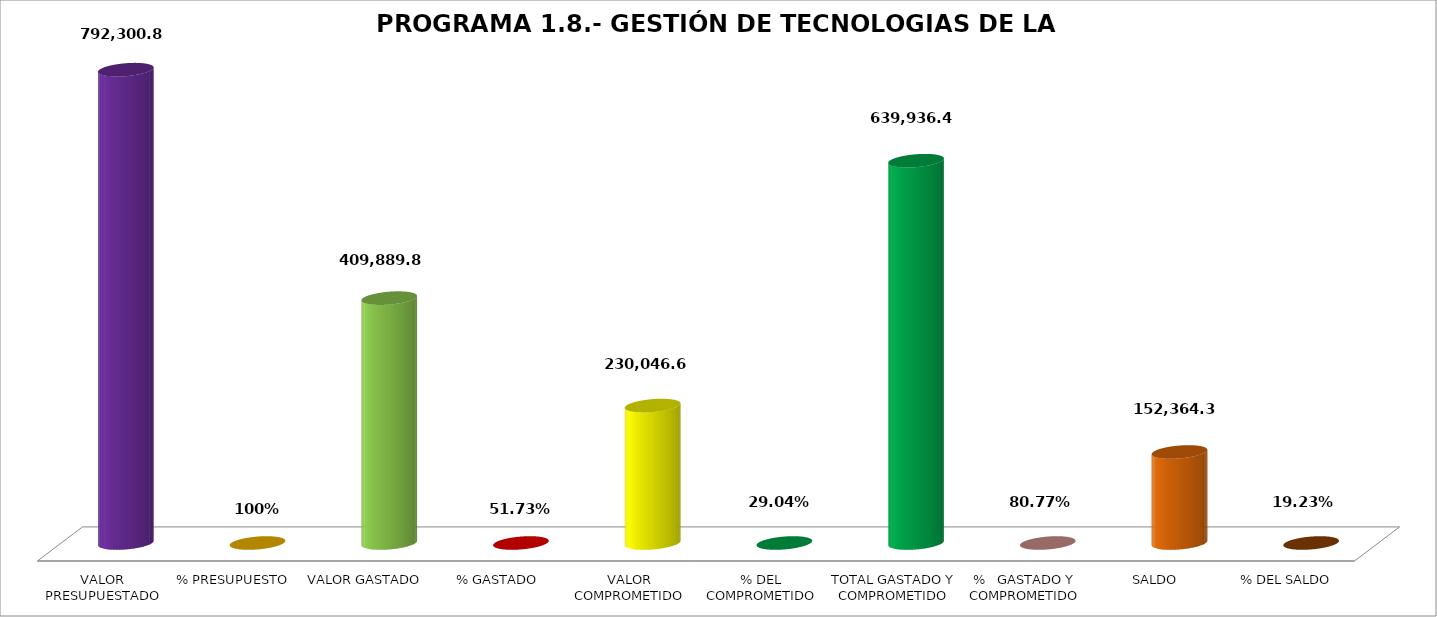
| Category | PROGRAMA 1.8.- GESTIÓN DE TECNOLOGIAS DE LA INFORMACIÓN |
|---|---|
| VALOR PRESUPUESTADO | 792300.87 |
| % PRESUPUESTO | 1 |
| VALOR GASTADO | 409889.81 |
| % GASTADO | 0.517 |
| VALOR COMPROMETIDO | 230046.68 |
| % DEL COMPROMETIDO | 0.29 |
| TOTAL GASTADO Y COMPROMETIDO | 639936.49 |
| %   GASTADO Y COMPROMETIDO | 0.808 |
| SALDO | 152364.38 |
| % DEL SALDO | 0.192 |